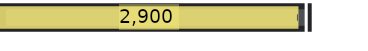
| Category | Summe von Ziel | Summe von Ist |
|---|---|---|
| Ergebnis | 3000 | 2900 |